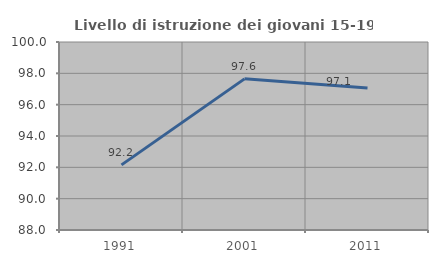
| Category | Livello di istruzione dei giovani 15-19 anni |
|---|---|
| 1991.0 | 92.157 |
| 2001.0 | 97.647 |
| 2011.0 | 97.059 |